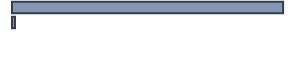
| Category | Series 0 |
|---|---|
| 0 | 98.946 |
| 1 | 1.054 |
| 2 | 0 |
| 3 | 0 |